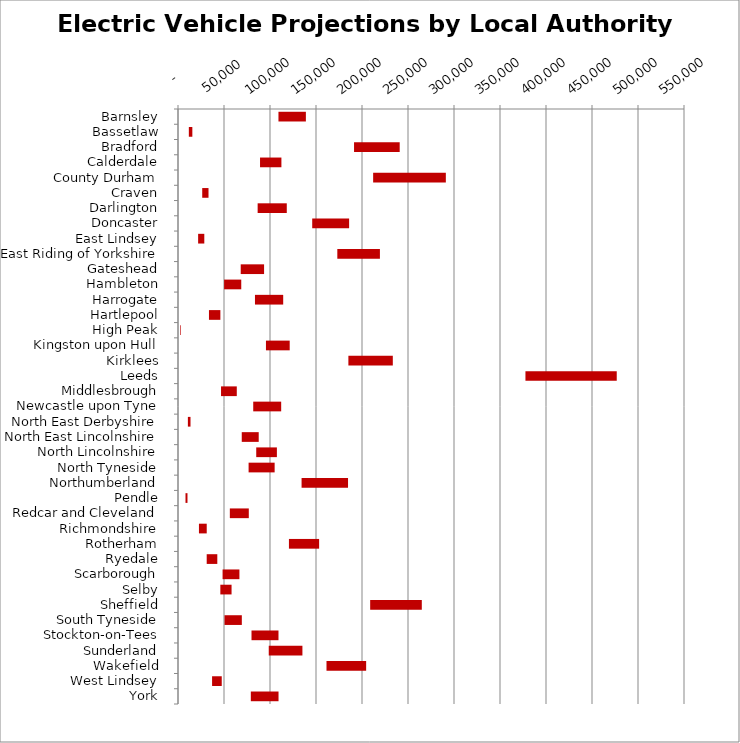
| Category | MIN | MAX |
|---|---|---|
| Barnsley | 109196 | 29799 |
| Bassetlaw | 11775 | 3814 |
| Bradford | 191352 | 49624 |
| Calderdale | 89167 | 23236 |
| County Durham | 212116 | 79011 |
| Craven | 26327 | 6834 |
| Darlington | 86565 | 31676 |
| Doncaster | 145884 | 40115 |
| East Lindsey | 21878 | 6713 |
| East Riding of Yorkshire | 173178 | 46293 |
| Gateshead | 68175 | 25390 |
| Hambleton | 50113 | 18643 |
| Harrogate | 83656 | 30689 |
| Hartlepool | 33652 | 12406 |
| High Peak | 2526 | 695 |
| Kingston upon Hull | 95598 | 25813 |
| Kirklees | 185200 | 48293 |
| Leeds | 377659 | 99238 |
| Middlesbrough | 46772 | 17124 |
| Newcastle upon Tyne | 81767 | 30389 |
| North East Derbyshire | 10735 | 2852 |
| North East Lincolnshire | 69292 | 18439 |
| North Lincolnshire | 85036 | 22452 |
| North Tyneside | 76737 | 28305 |
| Northumberland | 134320 | 50498 |
| Pendle | 8151 | 2150 |
| Redcar and Cleveland | 56346 | 20605 |
| Richmondshire | 22764 | 8460 |
| Rotherham | 120577 | 32815 |
| Ryedale | 31194 | 11527 |
| Scarborough | 48449 | 18304 |
| Selby | 46020 | 12197 |
| Sheffield | 208884 | 56120 |
| South Tyneside | 50569 | 18805 |
| Stockton-on-Tees | 79895 | 29332 |
| Sunderland | 98639 | 36596 |
| Wakefield | 161417 | 43089 |
| West Lindsey | 37041 | 10508 |
| York | 79149 | 30122 |